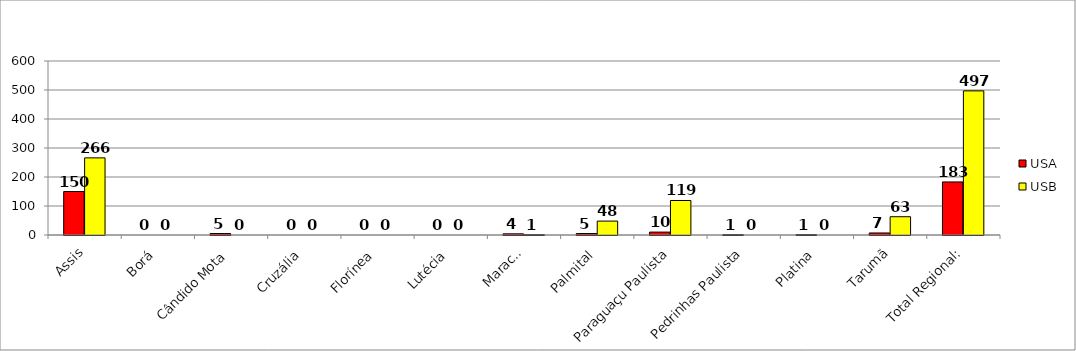
| Category | USA | USB |
|---|---|---|
| Assis | 150 | 266 |
| Borá | 0 | 0 |
| Cândido Mota | 5 | 0 |
| Cruzália | 0 | 0 |
| Florínea | 0 | 0 |
| Lutécia | 0 | 0 |
| Maracaí | 4 | 1 |
| Palmital | 5 | 48 |
| Paraguaçu Paulista | 10 | 119 |
| Pedrinhas Paulista | 1 | 0 |
| Platina | 1 | 0 |
| Tarumã | 7 | 63 |
| Total Regional: | 183 | 497 |